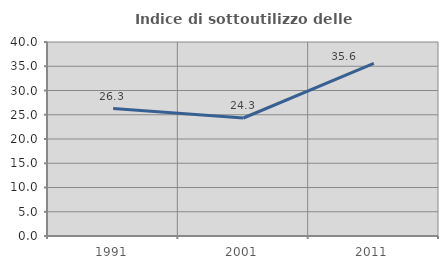
| Category | Indice di sottoutilizzo delle abitazioni  |
|---|---|
| 1991.0 | 26.28 |
| 2001.0 | 24.331 |
| 2011.0 | 35.615 |